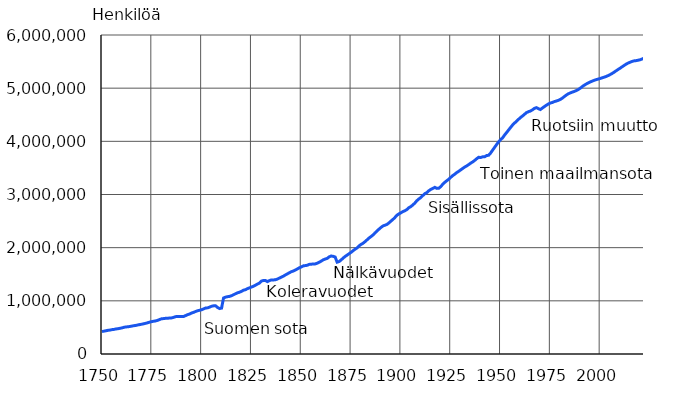
| Category | Series 0 |
|---|---|
| 1750.0 | 421500 |
| 1751.0 | 429900 |
| 1752.0 | 437600 |
| 1753.0 | 445300 |
| 1754.0 | 450100 |
| 1755.0 | 457800 |
| 1756.0 | 462600 |
| 1757.0 | 470900 |
| 1758.0 | 476000 |
| 1759.0 | 482900 |
| 1760.0 | 491100 |
| 1761.0 | 501400 |
| 1762.0 | 509000 |
| 1763.0 | 511700 |
| 1764.0 | 518300 |
| 1765.0 | 525200 |
| 1766.0 | 532100 |
| 1767.0 | 537800 |
| 1768.0 | 546500 |
| 1769.0 | 553700 |
| 1770.0 | 561000 |
| 1771.0 | 569000 |
| 1772.0 | 578100 |
| 1773.0 | 588400 |
| 1774.0 | 600400 |
| 1775.0 | 610100 |
| 1776.0 | 616400 |
| 1777.0 | 622600 |
| 1778.0 | 634800 |
| 1779.0 | 649600 |
| 1780.0 | 663900 |
| 1781.0 | 665900 |
| 1782.0 | 671600 |
| 1783.0 | 672100 |
| 1784.0 | 678400 |
| 1785.0 | 679400 |
| 1786.0 | 690000 |
| 1787.0 | 703000 |
| 1788.0 | 706300 |
| 1789.0 | 705100 |
| 1790.0 | 705600 |
| 1791.0 | 706600 |
| 1792.0 | 723300 |
| 1793.0 | 741000 |
| 1794.0 | 752400 |
| 1795.0 | 770800 |
| 1796.0 | 783500 |
| 1797.0 | 800100 |
| 1798.0 | 813500 |
| 1799.0 | 822600 |
| 1800.0 | 832700 |
| 1801.0 | 848900 |
| 1802.0 | 864700 |
| 1803.0 | 868200 |
| 1804.0 | 881800 |
| 1805.0 | 898400 |
| 1806.0 | 905600 |
| 1807.0 | 906800 |
| 1808.0 | 874800 |
| 1809.0 | 854800 |
| 1810.0 | 863300 |
| 1811.0 | 1053400 |
| 1812.0 | 1069300 |
| 1813.0 | 1078300 |
| 1814.0 | 1083200 |
| 1815.0 | 1096000 |
| 1816.0 | 1114700 |
| 1817.0 | 1133300 |
| 1818.0 | 1150700 |
| 1819.0 | 1162600 |
| 1820.0 | 1177500 |
| 1821.0 | 1199900 |
| 1822.0 | 1209700 |
| 1823.0 | 1229800 |
| 1824.0 | 1243200 |
| 1825.0 | 1259200 |
| 1826.0 | 1274700 |
| 1827.0 | 1294100 |
| 1828.0 | 1315800 |
| 1829.0 | 1332000 |
| 1830.0 | 1372100 |
| 1831.0 | 1381900 |
| 1832.0 | 1383500 |
| 1833.0 | 1361800 |
| 1834.0 | 1379800 |
| 1835.0 | 1393700 |
| 1836.0 | 1392400 |
| 1837.0 | 1396600 |
| 1838.0 | 1409400 |
| 1839.0 | 1427800 |
| 1840.0 | 1445600 |
| 1841.0 | 1463100 |
| 1842.0 | 1486100 |
| 1843.0 | 1507000 |
| 1844.0 | 1527500 |
| 1845.0 | 1547700 |
| 1846.0 | 1561100 |
| 1847.0 | 1578400 |
| 1848.0 | 1599300 |
| 1849.0 | 1620900 |
| 1850.0 | 1636900 |
| 1851.0 | 1657600 |
| 1852.0 | 1662800 |
| 1853.0 | 1669200 |
| 1854.0 | 1685500 |
| 1855.0 | 1688700 |
| 1856.0 | 1693300 |
| 1857.0 | 1694400 |
| 1858.0 | 1706800 |
| 1859.0 | 1726000 |
| 1860.0 | 1746700 |
| 1861.0 | 1770600 |
| 1862.0 | 1786200 |
| 1863.0 | 1797400 |
| 1864.0 | 1827000 |
| 1865.0 | 1843200 |
| 1866.0 | 1837500 |
| 1867.0 | 1824200 |
| 1868.0 | 1727500 |
| 1869.0 | 1739600 |
| 1870.0 | 1768800 |
| 1871.0 | 1803800 |
| 1872.0 | 1834600 |
| 1873.0 | 1860000 |
| 1874.0 | 1886100 |
| 1875.0 | 1912600 |
| 1876.0 | 1942700 |
| 1877.0 | 1971400 |
| 1878.0 | 1994600 |
| 1879.0 | 2032700 |
| 1880.0 | 2060800 |
| 1881.0 | 2082600 |
| 1882.0 | 2113300 |
| 1883.0 | 2146400 |
| 1884.0 | 2180500 |
| 1885.0 | 2208500 |
| 1886.0 | 2238600 |
| 1887.0 | 2278100 |
| 1888.0 | 2314200 |
| 1889.0 | 2347700 |
| 1890.0 | 2380100 |
| 1891.0 | 2408300 |
| 1892.0 | 2422500 |
| 1893.0 | 2436700 |
| 1894.0 | 2465700 |
| 1895.0 | 2499900 |
| 1896.0 | 2530900 |
| 1897.0 | 2567500 |
| 1898.0 | 2610300 |
| 1899.0 | 2635300 |
| 1900.0 | 2655900 |
| 1901.0 | 2678500 |
| 1902.0 | 2693900 |
| 1903.0 | 2717100 |
| 1904.0 | 2751900 |
| 1905.0 | 2773000 |
| 1906.0 | 2803700 |
| 1907.0 | 2838700 |
| 1908.0 | 2883000 |
| 1909.0 | 2914800 |
| 1910.0 | 2943400 |
| 1911.0 | 2980000 |
| 1912.0 | 3015500 |
| 1913.0 | 3035800 |
| 1914.0 | 3069500 |
| 1915.0 | 3096300 |
| 1916.0 | 3114200 |
| 1917.0 | 3134300 |
| 1918.0 | 3115300 |
| 1919.0 | 3118000 |
| 1920.0 | 3147600 |
| 1921.0 | 3193200 |
| 1922.0 | 3227800 |
| 1923.0 | 3258600 |
| 1924.0 | 3286200 |
| 1925.0 | 3322100 |
| 1926.0 | 3355200 |
| 1927.0 | 3380600 |
| 1928.0 | 3412100 |
| 1929.0 | 3435300 |
| 1930.0 | 3462700 |
| 1931.0 | 3489600 |
| 1932.0 | 3516000 |
| 1933.0 | 3536600 |
| 1934.0 | 3561600 |
| 1935.0 | 3589600 |
| 1936.0 | 3612400 |
| 1937.0 | 3640200 |
| 1938.0 | 3672100 |
| 1939.0 | 3699700 |
| 1940.0 | 3695617 |
| 1941.0 | 3707815 |
| 1942.0 | 3708801 |
| 1943.0 | 3732532 |
| 1944.0 | 3737096 |
| 1945.0 | 3778890 |
| 1946.0 | 3833072 |
| 1947.0 | 3885284 |
| 1948.0 | 3937840 |
| 1949.0 | 3987996 |
| 1950.0 | 4029803 |
| 1951.0 | 4064727 |
| 1952.0 | 4116228 |
| 1953.0 | 4162609 |
| 1954.0 | 4211191 |
| 1955.0 | 4258571 |
| 1956.0 | 4304832 |
| 1957.0 | 4343190 |
| 1958.0 | 4376314 |
| 1959.0 | 4413046 |
| 1960.0 | 4446222 |
| 1961.0 | 4475787 |
| 1962.0 | 4507098 |
| 1963.0 | 4539519 |
| 1964.0 | 4557567 |
| 1965.0 | 4569896 |
| 1966.0 | 4591842 |
| 1967.0 | 4619645 |
| 1968.0 | 4633292 |
| 1969.0 | 4614277 |
| 1970.0 | 4598336 |
| 1971.0 | 4625912 |
| 1972.0 | 4653401 |
| 1973.0 | 4678761 |
| 1974.0 | 4702387 |
| 1975.0 | 4720492 |
| 1976.0 | 4730836 |
| 1977.0 | 4746967 |
| 1978.0 | 4758088 |
| 1979.0 | 4771292 |
| 1980.0 | 4787778 |
| 1981.0 | 4812150 |
| 1982.0 | 4841715 |
| 1983.0 | 4869858 |
| 1984.0 | 4893748 |
| 1985.0 | 4910664 |
| 1986.0 | 4925644 |
| 1987.0 | 4938602 |
| 1988.0 | 4954359 |
| 1989.0 | 4974383 |
| 1990.0 | 4998478 |
| 1991.0 | 5029002 |
| 1992.0 | 5054982 |
| 1993.0 | 5077912 |
| 1994.0 | 5098754 |
| 1995.0 | 5116826 |
| 1996.0 | 5132320 |
| 1997.0 | 5147349 |
| 1998.0 | 5159646 |
| 1999.0 | 5171302 |
| 2000.0 | 5181115 |
| 2001.0 | 5194901 |
| 2002.0 | 5206295 |
| 2003.0 | 5219732 |
| 2004.0 | 5236611 |
| 2005.0 | 5255580 |
| 2006.0 | 5276955 |
| 2007.0 | 5300484 |
| 2008.0 | 5326314 |
| 2009.0 | 5351427 |
| 2010.0 | 5375276 |
| 2011.0 | 5401267 |
| 2012.0 | 5426674 |
| 2013.0 | 5451270 |
| 2014.0 | 5471753 |
| 2015.0 | 5487308 |
| 2016.0 | 5503297 |
| 2017.0 | 5513130 |
| 2018.0 | 5517919 |
| 2019.0 | 5525292 |
| 2020.0 | 5533793 |
| 2021.0 | 5548241 |
| 2022.0 | 5563970 |